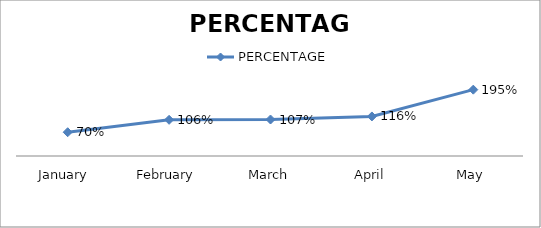
| Category | PERCENTAGE |
|---|---|
| January  | 0.699 |
| February | 1.064 |
| March | 1.073 |
| April | 1.163 |
| May | 1.951 |